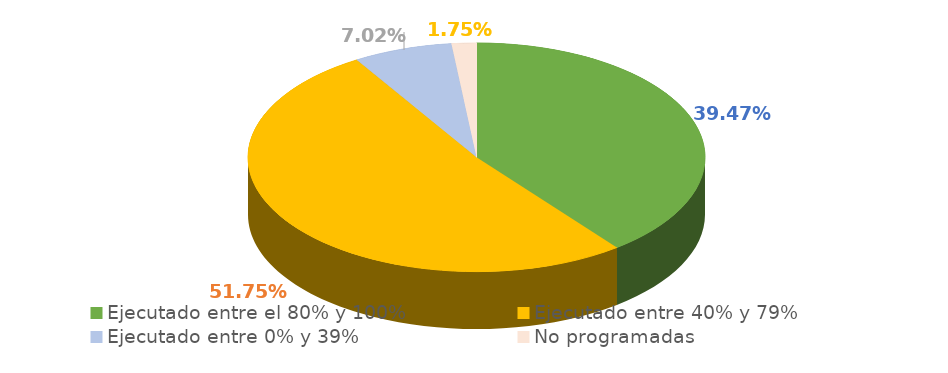
| Category | Series 0 |
|---|---|
| Ejecutado entre el 80% y 100% | 0.395 |
| Ejecutado entre 40% y 79% | 0.518 |
| Ejecutado entre 0% y 39% | 0.07 |
| No programadas | 0.018 |